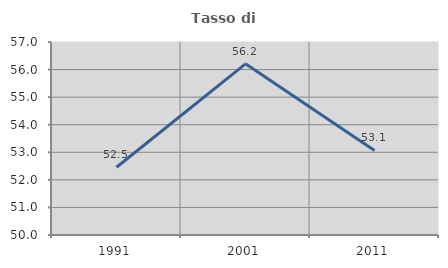
| Category | Tasso di occupazione   |
|---|---|
| 1991.0 | 52.458 |
| 2001.0 | 56.208 |
| 2011.0 | 53.069 |